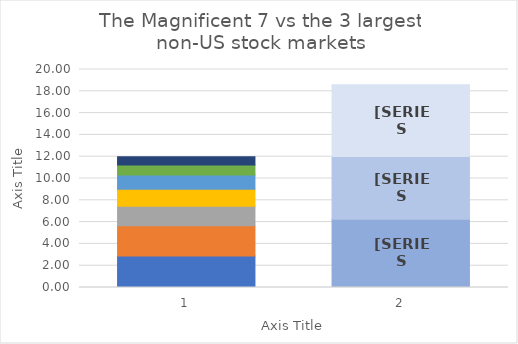
| Category | AAPL | MSFT | GOOGL | AMZN | NVDA | META | TSLA | Euronext | Japan | Shanghai |
|---|---|---|---|---|---|---|---|---|---|---|
| 0 | 2.879 | 2.793 | 1.773 | 1.564 | 1.313 | 0.919 | 0.747 | 0 | 0 | 0 |
| 1 | 0 | 0 | 0 | 0 | 0 | 0 | 0 | 6.26 | 5.75 | 6.6 |